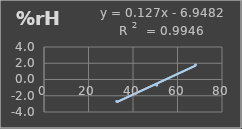
| Category | Humedad |
|---|---|
| 32.7 | -2.7 |
| 50.7 | -0.7 |
| 68.1 | 1.8 |